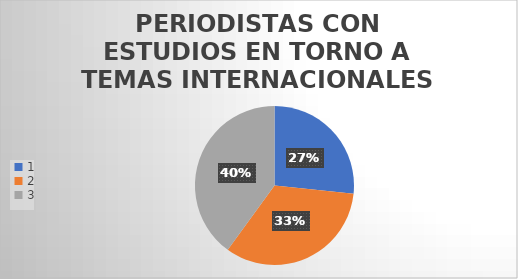
| Category | Series 0 |
|---|---|
| 0 | 4 |
| 1 | 5 |
| 2 | 6 |